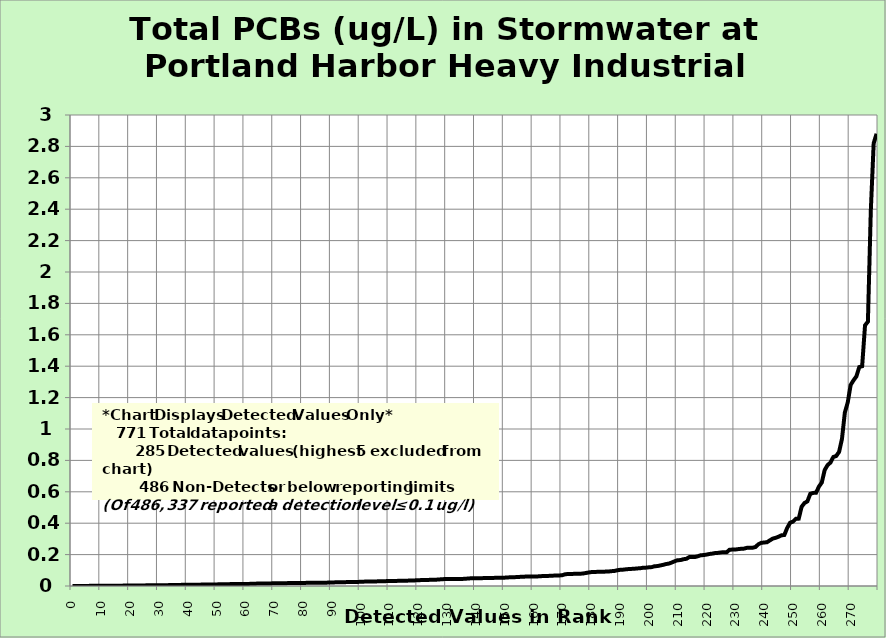
| Category | PCBs |
|---|---|
| 0.0 | 0 |
| 1.0 | 0 |
| 2.0 | 0 |
| 3.0 | 0 |
| 4.0 | 0.001 |
| 5.0 | 0.001 |
| 6.0 | 0.001 |
| 7.0 | 0.001 |
| 8.0 | 0.001 |
| 9.0 | 0.001 |
| 10.0 | 0.001 |
| 11.0 | 0.001 |
| 12.0 | 0.002 |
| 13.0 | 0.002 |
| 14.0 | 0.002 |
| 15.0 | 0.002 |
| 16.0 | 0.002 |
| 17.0 | 0.002 |
| 18.0 | 0.002 |
| 19.0 | 0.003 |
| 20.0 | 0.003 |
| 21.0 | 0.003 |
| 22.0 | 0.003 |
| 23.0 | 0.003 |
| 24.0 | 0.004 |
| 25.0 | 0.004 |
| 26.0 | 0.004 |
| 27.0 | 0.004 |
| 28.0 | 0.005 |
| 29.0 | 0.005 |
| 30.0 | 0.005 |
| 31.0 | 0.005 |
| 32.0 | 0.005 |
| 33.0 | 0.006 |
| 34.0 | 0.006 |
| 35.0 | 0.006 |
| 36.0 | 0.006 |
| 37.0 | 0.007 |
| 38.0 | 0.007 |
| 39.0 | 0.008 |
| 40.0 | 0.008 |
| 41.0 | 0.008 |
| 42.0 | 0.008 |
| 43.0 | 0.008 |
| 44.0 | 0.008 |
| 45.0 | 0.009 |
| 46.0 | 0.009 |
| 47.0 | 0.01 |
| 48.0 | 0.01 |
| 49.0 | 0.01 |
| 50.0 | 0.01 |
| 51.0 | 0.011 |
| 52.0 | 0.011 |
| 53.0 | 0.012 |
| 54.0 | 0.012 |
| 55.0 | 0.012 |
| 56.0 | 0.012 |
| 57.0 | 0.013 |
| 58.0 | 0.013 |
| 59.0 | 0.013 |
| 60.0 | 0.013 |
| 61.0 | 0.013 |
| 62.0 | 0.014 |
| 63.0 | 0.014 |
| 64.0 | 0.015 |
| 65.0 | 0.016 |
| 66.0 | 0.016 |
| 67.0 | 0.016 |
| 68.0 | 0.016 |
| 69.0 | 0.017 |
| 70.0 | 0.018 |
| 71.0 | 0.018 |
| 72.0 | 0.018 |
| 73.0 | 0.018 |
| 74.0 | 0.018 |
| 75.0 | 0.018 |
| 76.0 | 0.019 |
| 77.0 | 0.019 |
| 78.0 | 0.019 |
| 79.0 | 0.019 |
| 80.0 | 0.019 |
| 81.0 | 0.02 |
| 82.0 | 0.02 |
| 83.0 | 0.02 |
| 84.0 | 0.02 |
| 85.0 | 0.021 |
| 86.0 | 0.021 |
| 87.0 | 0.021 |
| 88.0 | 0.021 |
| 89.0 | 0.022 |
| 90.0 | 0.022 |
| 91.0 | 0.023 |
| 92.0 | 0.024 |
| 93.0 | 0.024 |
| 94.0 | 0.024 |
| 95.0 | 0.025 |
| 96.0 | 0.025 |
| 97.0 | 0.025 |
| 98.0 | 0.025 |
| 99.0 | 0.026 |
| 100.0 | 0.027 |
| 101.0 | 0.028 |
| 102.0 | 0.028 |
| 103.0 | 0.028 |
| 104.0 | 0.029 |
| 105.0 | 0.029 |
| 106.0 | 0.03 |
| 107.0 | 0.03 |
| 108.0 | 0.031 |
| 109.0 | 0.031 |
| 110.0 | 0.031 |
| 111.0 | 0.032 |
| 112.0 | 0.032 |
| 113.0 | 0.033 |
| 114.0 | 0.033 |
| 115.0 | 0.033 |
| 116.0 | 0.034 |
| 117.0 | 0.035 |
| 118.0 | 0.035 |
| 119.0 | 0.036 |
| 120.0 | 0.037 |
| 121.0 | 0.038 |
| 122.0 | 0.039 |
| 123.0 | 0.039 |
| 124.0 | 0.039 |
| 125.0 | 0.039 |
| 126.0 | 0.04 |
| 127.0 | 0.042 |
| 128.0 | 0.043 |
| 129.0 | 0.044 |
| 130.0 | 0.045 |
| 131.0 | 0.045 |
| 132.0 | 0.045 |
| 133.0 | 0.045 |
| 134.0 | 0.045 |
| 135.0 | 0.045 |
| 136.0 | 0.046 |
| 137.0 | 0.047 |
| 138.0 | 0.049 |
| 139.0 | 0.049 |
| 140.0 | 0.05 |
| 141.0 | 0.05 |
| 142.0 | 0.05 |
| 143.0 | 0.05 |
| 144.0 | 0.051 |
| 145.0 | 0.051 |
| 146.0 | 0.052 |
| 147.0 | 0.052 |
| 148.0 | 0.052 |
| 149.0 | 0.053 |
| 150.0 | 0.053 |
| 151.0 | 0.055 |
| 152.0 | 0.055 |
| 153.0 | 0.056 |
| 154.0 | 0.057 |
| 155.0 | 0.058 |
| 156.0 | 0.059 |
| 157.0 | 0.06 |
| 158.0 | 0.06 |
| 159.0 | 0.06 |
| 160.0 | 0.06 |
| 161.0 | 0.06 |
| 162.0 | 0.062 |
| 163.0 | 0.063 |
| 164.0 | 0.064 |
| 165.0 | 0.064 |
| 166.0 | 0.065 |
| 167.0 | 0.066 |
| 168.0 | 0.067 |
| 169.0 | 0.067 |
| 170.0 | 0.069 |
| 171.0 | 0.075 |
| 172.0 | 0.076 |
| 173.0 | 0.077 |
| 174.0 | 0.077 |
| 175.0 | 0.078 |
| 176.0 | 0.078 |
| 177.0 | 0.079 |
| 178.0 | 0.082 |
| 179.0 | 0.086 |
| 180.0 | 0.088 |
| 181.0 | 0.089 |
| 182.0 | 0.09 |
| 183.0 | 0.091 |
| 184.0 | 0.091 |
| 185.0 | 0.092 |
| 186.0 | 0.092 |
| 187.0 | 0.095 |
| 188.0 | 0.096 |
| 189.0 | 0.1 |
| 190.0 | 0.103 |
| 191.0 | 0.104 |
| 192.0 | 0.106 |
| 193.0 | 0.108 |
| 194.0 | 0.109 |
| 195.0 | 0.11 |
| 196.0 | 0.112 |
| 197.0 | 0.113 |
| 198.0 | 0.116 |
| 199.0 | 0.117 |
| 200.0 | 0.119 |
| 201.0 | 0.12 |
| 202.0 | 0.126 |
| 203.0 | 0.127 |
| 204.0 | 0.131 |
| 205.0 | 0.135 |
| 206.0 | 0.14 |
| 207.0 | 0.143 |
| 208.0 | 0.15 |
| 209.0 | 0.158 |
| 210.0 | 0.164 |
| 211.0 | 0.165 |
| 212.0 | 0.171 |
| 213.0 | 0.173 |
| 214.0 | 0.184 |
| 215.0 | 0.184 |
| 216.0 | 0.185 |
| 217.0 | 0.189 |
| 218.0 | 0.196 |
| 219.0 | 0.197 |
| 220.0 | 0.2 |
| 221.0 | 0.204 |
| 222.0 | 0.206 |
| 223.0 | 0.21 |
| 224.0 | 0.211 |
| 225.0 | 0.214 |
| 226.0 | 0.215 |
| 227.0 | 0.215 |
| 228.0 | 0.231 |
| 229.0 | 0.232 |
| 230.0 | 0.232 |
| 231.0 | 0.235 |
| 232.0 | 0.237 |
| 233.0 | 0.238 |
| 234.0 | 0.243 |
| 235.0 | 0.243 |
| 236.0 | 0.244 |
| 237.0 | 0.248 |
| 238.0 | 0.266 |
| 239.0 | 0.275 |
| 240.0 | 0.277 |
| 241.0 | 0.279 |
| 242.0 | 0.291 |
| 243.0 | 0.302 |
| 244.0 | 0.307 |
| 245.0 | 0.314 |
| 246.0 | 0.323 |
| 247.0 | 0.325 |
| 248.0 | 0.37 |
| 249.0 | 0.403 |
| 250.0 | 0.41 |
| 251.0 | 0.428 |
| 252.0 | 0.429 |
| 253.0 | 0.505 |
| 254.0 | 0.529 |
| 255.0 | 0.539 |
| 256.0 | 0.587 |
| 257.0 | 0.593 |
| 258.0 | 0.594 |
| 259.0 | 0.633 |
| 260.0 | 0.659 |
| 261.0 | 0.739 |
| 262.0 | 0.77 |
| 263.0 | 0.786 |
| 264.0 | 0.822 |
| 265.0 | 0.828 |
| 266.0 | 0.854 |
| 267.0 | 0.937 |
| 268.0 | 1.105 |
| 269.0 | 1.169 |
| 270.0 | 1.28 |
| 271.0 | 1.31 |
| 272.0 | 1.335 |
| 273.0 | 1.394 |
| 274.0 | 1.4 |
| 275.0 | 1.66 |
| 276.0 | 1.684 |
| 277.0 | 2.388 |
| 278.0 | 2.82 |
| 279.0 | 2.881 |